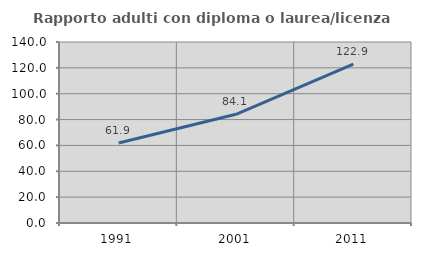
| Category | Rapporto adulti con diploma o laurea/licenza media  |
|---|---|
| 1991.0 | 61.901 |
| 2001.0 | 84.098 |
| 2011.0 | 122.895 |